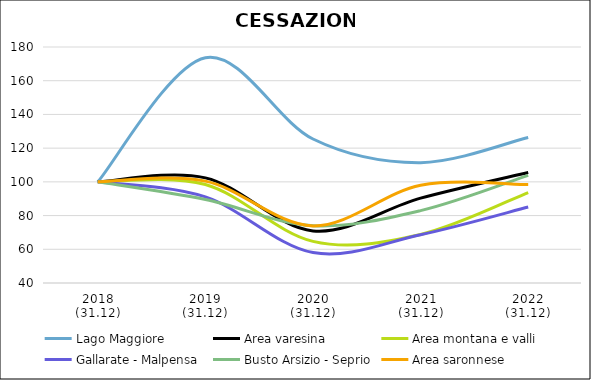
| Category | Lago Maggiore | Area varesina | Area montana e valli | Gallarate - Malpensa | Busto Arsizio - Seprio | Area saronnese |
|---|---|---|---|---|---|---|
| 2018
(31.12) | 100 | 100 | 100 | 100 | 100 | 100 |
| 2019
(31.12) | 173.645 | 102.378 | 98.417 | 91.074 | 89.499 | 100.434 |
| 2020
(31.12) | 125.421 | 70.914 | 64.677 | 58.033 | 73.983 | 73.878 |
| 2021
(31.12) | 111.402 | 90.338 | 68.819 | 68.65 | 82.923 | 97.974 |
| 2022
(31.12) | 126.355 | 105.582 | 93.666 | 85.061 | 103.832 | 98.408 |